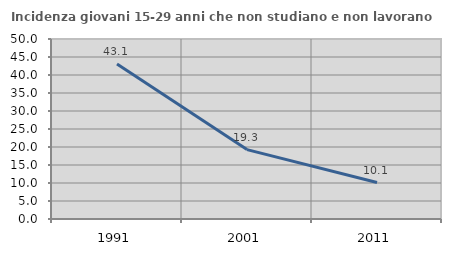
| Category | Incidenza giovani 15-29 anni che non studiano e non lavorano  |
|---|---|
| 1991.0 | 43.081 |
| 2001.0 | 19.277 |
| 2011.0 | 10.119 |